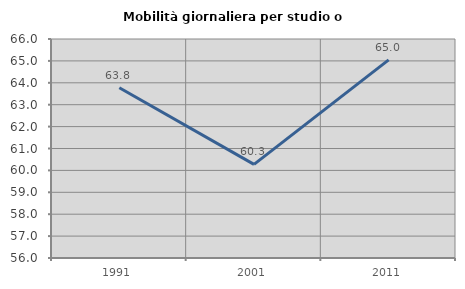
| Category | Mobilità giornaliera per studio o lavoro |
|---|---|
| 1991.0 | 63.777 |
| 2001.0 | 60.277 |
| 2011.0 | 65.047 |